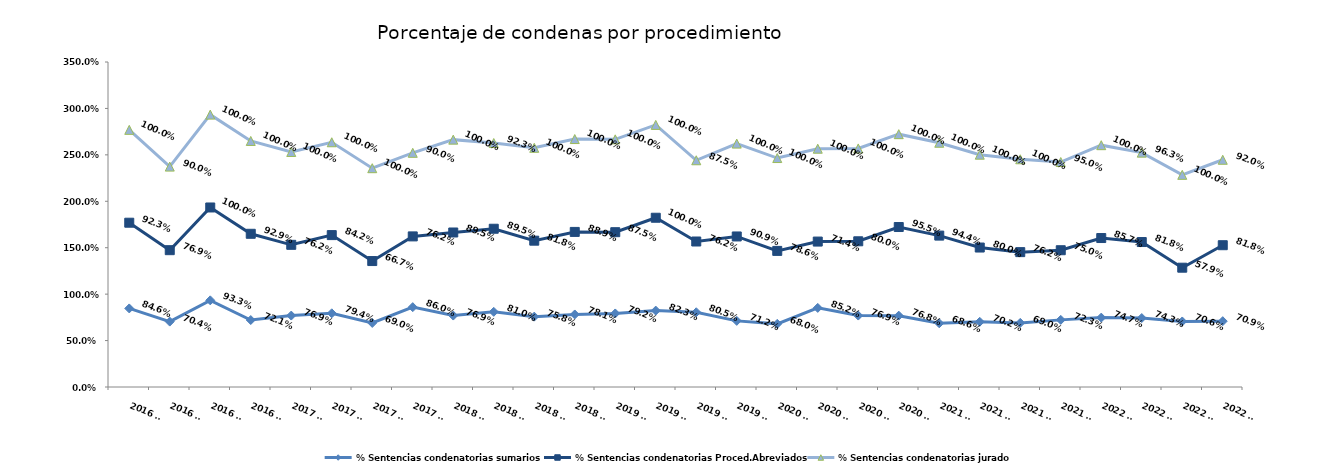
| Category | % Sentencias condenatorias sumarios | % Sentencias condenatorias Proced.Abreviados | % Sentencias condenatorias jurado |
|---|---|---|---|
| 2016 T1 | 0.846 | 0.923 | 1 |
| 2016 T2 | 0.704 | 0.769 | 0.9 |
| 2016 T3 | 0.933 | 1 | 1 |
| 2016 T4 | 0.721 | 0.929 | 1 |
| 2017 T1 | 0.769 | 0.762 | 1 |
| 2017 T2 | 0.794 | 0.842 | 1 |
| 2017 T3 | 0.69 | 0.667 | 1 |
| 2017 T4 | 0.86 | 0.762 | 0.9 |
| 2018 T1 | 0.769 | 0.895 | 1 |
| 2018 T2 | 0.81 | 0.895 | 0.923 |
| 2018 T3 | 0.758 | 0.818 | 1 |
| 2018 T4 | 0.781 | 0.889 | 1 |
| 2019 T1 | 0.792 | 0.875 | 1 |
| 2019 T2 | 0.823 | 1 | 1 |
| 2019 T3 | 0.805 | 0.762 | 0.875 |
| 2019 T4 | 0.712 | 0.909 | 1 |
| 2020 T1 | 0.68 | 0.786 | 1 |
| 2020 T2 | 0.852 | 0.714 | 1 |
| 2020 T3 | 0.769 | 0.8 | 1 |
| 2020 T4 | 0.768 | 0.955 | 1 |
| 2021 T1 | 0.686 | 0.944 | 1 |
| 2021 T2 | 0.702 | 0.8 | 1 |
| 2021 T3 | 0.69 | 0.762 | 1 |
| 2021 T4 | 0.723 | 0.75 | 0.95 |
| 2022 T1 | 0.747 | 0.857 | 1 |
| 2022 T2 | 0.743 | 0.818 | 0.963 |
| 2022 T3 | 0.706 | 0.579 | 1 |
| 2022 T4 | 0.709 | 0.818 | 0.92 |